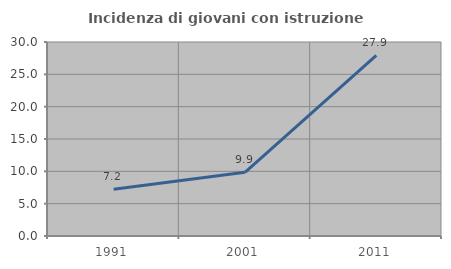
| Category | Incidenza di giovani con istruzione universitaria |
|---|---|
| 1991.0 | 7.235 |
| 2001.0 | 9.855 |
| 2011.0 | 27.922 |